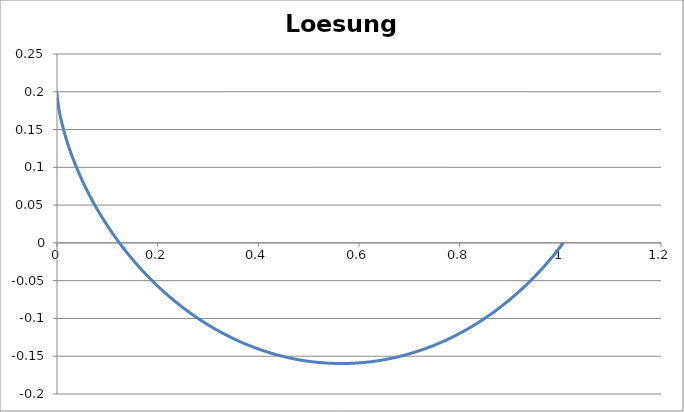
| Category | Loesung1 |
|---|---|
| 0.0 | 0.2 |
| 2.397704693608234e-07 | 0.2 |
| 1.9180486682404087e-06 | 0.2 |
| 6.4727669422459104e-06 | 0.2 |
| 1.5340707099303794e-05 | 0.199 |
| 2.995692571610343e-05 | 0.199 |
| 5.1754180134581445e-05 | 0.199 |
| 8.216235537811266e-05 | 0.198 |
| 0.00012260789221653945 | 0.198 |
| 0.00017451321660890914 | 0.197 |
| 0.00023929617075203575 | 0.196 |
| 0.0003183694459625251 | 0.196 |
| 0.0004131400176191067 | 0.195 |
| 0.0005250085823912127 | 0.194 |
| 0.0006553689979790113 | 0.193 |
| 0.000805607725588892 | 0.192 |
| 0.0009771032753674684 | 0.191 |
| 0.001171225655015924 | 0.19 |
| 0.001389335821805168 | 0.188 |
| 0.0016327851382110887 | 0.187 |
| 0.001902914831387588 | 0.186 |
| 0.0022010554566935896 | 0.184 |
| 0.002528526365488619 | 0.183 |
| 0.0028866351774099056 | 0.181 |
| 0.0032766772573418973 | 0.18 |
| 0.003699935197287639 | 0.178 |
| 0.0041576783033490106 | 0.176 |
| 0.004651162088021259 | 0.174 |
| 0.00518162776800475 | 0.173 |
| 0.005750301767734719 | 0.171 |
| 0.006358395228828057 | 0.169 |
| 0.007007103525642629 | 0.167 |
| 0.007697605787143531 | 0.164 |
| 0.008431064425267275 | 0.162 |
| 0.0092086246699724 | 0.16 |
| 0.0100314141111629 | 0.158 |
| 0.010900542247667178 | 0.155 |
| 0.011817100043453347 | 0.153 |
| 0.012782159491258232 | 0.151 |
| 0.013796773183804498 | 0.148 |
| 0.014861973892777625 | 0.145 |
| 0.015978774155731047 | 0.143 |
| 0.017148165871084534 | 0.14 |
| 0.018371119901378165 | 0.137 |
| 0.019648585684940153 | 0.135 |
| 0.02098149085612424 | 0.132 |
| 0.022370740874268293 | 0.129 |
| 0.023817218661522636 | 0.126 |
| 0.025321784249692995 | 0.123 |
| 0.026885274436239236 | 0.12 |
| 0.0285085024495675 | 0.117 |
| 0.0301922576237497 | 0.114 |
| 0.031937305082800474 | 0.111 |
| 0.033744385434637675 | 0.108 |
| 0.035614214474849165 | 0.105 |
| 0.037547482900384094 | 0.102 |
| 0.039544856033283324 | 0.099 |
| 0.041606973554559494 | 0.095 |
| 0.04373444924833314 | 0.092 |
| 0.04592787075632721 | 0.089 |
| 0.048187799342818284 | 0.085 |
| 0.0505147696701382 | 0.082 |
| 0.05290928958481646 | 0.079 |
| 0.055371839914448155 | 0.075 |
| 0.05790287427536954 | 0.072 |
| 0.060502818891217405 | 0.068 |
| 0.06317207242244542 | 0.065 |
| 0.06591100580686514 | 0.061 |
| 0.06871996211127594 | 0.058 |
| 0.07159925639424282 | 0.054 |
| 0.0745491755800772 | 0.051 |
| 0.07756997834407099 | 0.047 |
| 0.0806618950090299 | 0.044 |
| 0.08382512745314748 | 0.04 |
| 0.08705984902925648 | 0.036 |
| 0.09036620449548999 | 0.033 |
| 0.09374430995738019 | 0.029 |
| 0.09719425282141761 | 0.026 |
| 0.10071609176008982 | 0.022 |
| 0.10430985668841303 | 0.019 |
| 0.10797554875196672 | 0.015 |
| 0.11171314032643515 | 0.011 |
| 0.1155225750286569 | 0.008 |
| 0.11940376773917749 | 0.004 |
| 0.12335660463629572 | 0.001 |
| 0.12738094324159102 | -0.003 |
| 0.13147661247691295 | -0.007 |
| 0.13564341273281005 | -0.01 |
| 0.13988111594837108 | -0.014 |
| 0.14418946570244628 | -0.017 |
| 0.14856817731621244 | -0.021 |
| 0.1530169379670406 | -0.024 |
| 0.15753540681362094 | -0.028 |
| 0.1621232151322948 | -0.031 |
| 0.16677996646453913 | -0.035 |
| 0.17150523677554483 | -0.038 |
| 0.1762985746238247 | -0.041 |
| 0.1811595013417843 | -0.045 |
| 0.18608751122718245 | -0.048 |
| 0.19108207174540537 | -0.051 |
| 0.19614262374247354 | -0.055 |
| 0.20126858166869582 | -0.058 |
| 0.2064593338128814 | -0.061 |
| 0.21171424254701623 | -0.064 |
| 0.21703264458130564 | -0.067 |
| 0.2224138512294815 | -0.071 |
| 0.22785714868426765 | -0.074 |
| 0.23336179830289286 | -0.077 |
| 0.2389270369025386 | -0.08 |
| 0.24455207706560164 | -0.083 |
| 0.25023610745465097 | -0.086 |
| 0.2559782931369514 | -0.089 |
| 0.26177777591842605 | -0.091 |
| 0.267633674686922 | -0.094 |
| 0.27354508576464437 | -0.097 |
| 0.2795110832696141 | -0.1 |
| 0.28553071948600944 | -0.102 |
| 0.29160302524323883 | -0.105 |
| 0.29772701030359716 | -0.107 |
| 0.3039016637583467 | -0.11 |
| 0.3101259544320677 | -0.112 |
| 0.3163988312951146 | -0.115 |
| 0.322719223884014 | -0.117 |
| 0.3290860427296355 | -0.119 |
| 0.33549817979296526 | -0.122 |
| 0.3419545089083064 | -0.124 |
| 0.3484538862337306 | -0.126 |
| 0.3549951507085994 | -0.128 |
| 0.36157712451797297 | -0.13 |
| 0.36819861356372074 | -0.132 |
| 0.37485840794214403 | -0.134 |
| 0.38155528242792225 | -0.136 |
| 0.388287996964186 | -0.138 |
| 0.3950552971585235 | -0.139 |
| 0.4018559147847212 | -0.141 |
| 0.40868856829003664 | -0.142 |
| 0.4155519633078032 | -0.144 |
| 0.4224447931751589 | -0.145 |
| 0.4293657394556943 | -0.147 |
| 0.43631347246681007 | -0.148 |
| 0.44328665181157134 | -0.149 |
| 0.4502839269148493 | -0.15 |
| 0.45730393756353266 | -0.152 |
| 0.4643453144505956 | -0.153 |
| 0.47140667972280154 | -0.154 |
| 0.47848664753182624 | -0.154 |
| 0.485583824588579 | -0.155 |
| 0.4926968107204994 | -0.156 |
| 0.4998241994316077 | -0.157 |
| 0.5069645784650847 | -0.157 |
| 0.5141165303681551 | -0.158 |
| 0.5212786330590503 | -0.158 |
| 0.528449460395822 | -0.159 |
| 0.5356275827467796 | -0.159 |
| 0.5428115675623244 | -0.159 |
| 0.5499999799479498 | -0.16 |
| 0.5571913832381803 | -0.16 |
| 0.5643843395712184 | -0.16 |
| 0.5715774104640702 | -0.16 |
| 0.5787691573879195 | -0.16 |
| 0.5859581423435197 | -0.159 |
| 0.5931429284363752 | -0.159 |
| 0.6003220804514791 | -0.159 |
| 0.6074941654273804 | -0.158 |
| 0.6146577532293502 | -0.158 |
| 0.6218114171214153 | -0.157 |
| 0.6289537343370344 | -0.157 |
| 0.636083286648185 | -0.156 |
| 0.6431986609326371 | -0.155 |
| 0.6502984497391814 | -0.155 |
| 0.6573812518505925 | -0.154 |
| 0.6644456728440965 | -0.153 |
| 0.6714903256491216 | -0.152 |
| 0.6785138311021076 | -0.151 |
| 0.6855148184981533 | -0.149 |
| 0.6924919261392802 | -0.148 |
| 0.6994438018790932 | -0.147 |
| 0.7063691036636212 | -0.146 |
| 0.7132665000681211 | -0.144 |
| 0.7201346708296297 | -0.143 |
| 0.7269723073750511 | -0.141 |
| 0.7337781133445692 | -0.139 |
| 0.7405508051101732 | -0.138 |
| 0.7472891122890932 | -0.136 |
| 0.7539917782519348 | -0.134 |
| 0.7606575606253149 | -0.132 |
| 0.7672852317887947 | -0.13 |
| 0.7738735793659113 | -0.128 |
| 0.7804214067091114 | -0.126 |
| 0.7869275333783958 | -0.124 |
| 0.7933907956134785 | -0.122 |
| 0.7998100467992753 | -0.12 |
| 0.8061841579245356 | -0.118 |
| 0.8125120180334306 | -0.115 |
| 0.818792534669922 | -0.113 |
| 0.8250246343147284 | -0.11 |
| 0.8312072628147199 | -0.108 |
| 0.8373393858045652 | -0.105 |
| 0.8434199891204633 | -0.103 |
| 0.8494480792057962 | -0.1 |
| 0.8554226835085375 | -0.097 |
| 0.8613428508702606 | -0.095 |
| 0.8672076519065909 | -0.092 |
| 0.8730161793789436 | -0.089 |
| 0.8787675485574109 | -0.086 |
| 0.8844608975746394 | -0.083 |
| 0.8900953877705675 | -0.08 |
| 0.8956702040278763 | -0.077 |
| 0.9011845550980279 | -0.074 |
| 0.9066376739177517 | -0.071 |
| 0.9120288179158625 | -0.068 |
| 0.9173572693102758 | -0.065 |
| 0.922622335395114 | -0.062 |
| 0.927823348817777 | -0.058 |
| 0.9329596678458765 | -0.055 |
| 0.9380306766239191 | -0.052 |
| 0.9430357854196406 | -0.049 |
| 0.9479744308598911 | -0.045 |
| 0.952846076155977 | -0.042 |
| 0.9576502113183684 | -0.039 |
| 0.9623863533606893 | -0.035 |
| 0.9670540464929048 | -0.032 |
| 0.9716528623036321 | -0.028 |
| 0.9761823999314975 | -0.025 |
| 0.980642286225478 | -0.021 |
| 0.9850321758941545 | -0.018 |
| 0.989351751643825 | -0.014 |
| 0.9936007243054183 | -0.011 |
| 0.9977788329501559 | -0.007 |
| 1.0018858449939223 | -0.004 |
| 1.0059215562902932 | 0 |